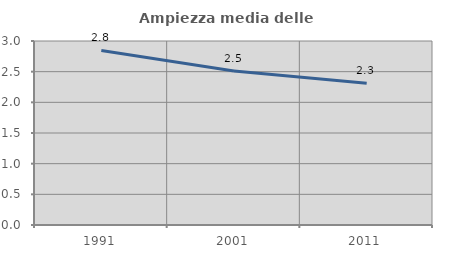
| Category | Ampiezza media delle famiglie |
|---|---|
| 1991.0 | 2.845 |
| 2001.0 | 2.511 |
| 2011.0 | 2.31 |